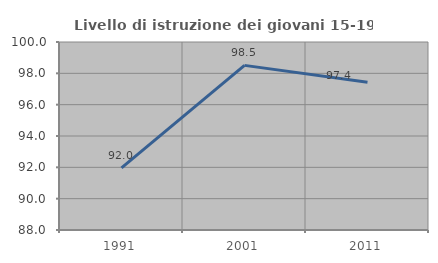
| Category | Livello di istruzione dei giovani 15-19 anni |
|---|---|
| 1991.0 | 91.96 |
| 2001.0 | 98.507 |
| 2011.0 | 97.436 |